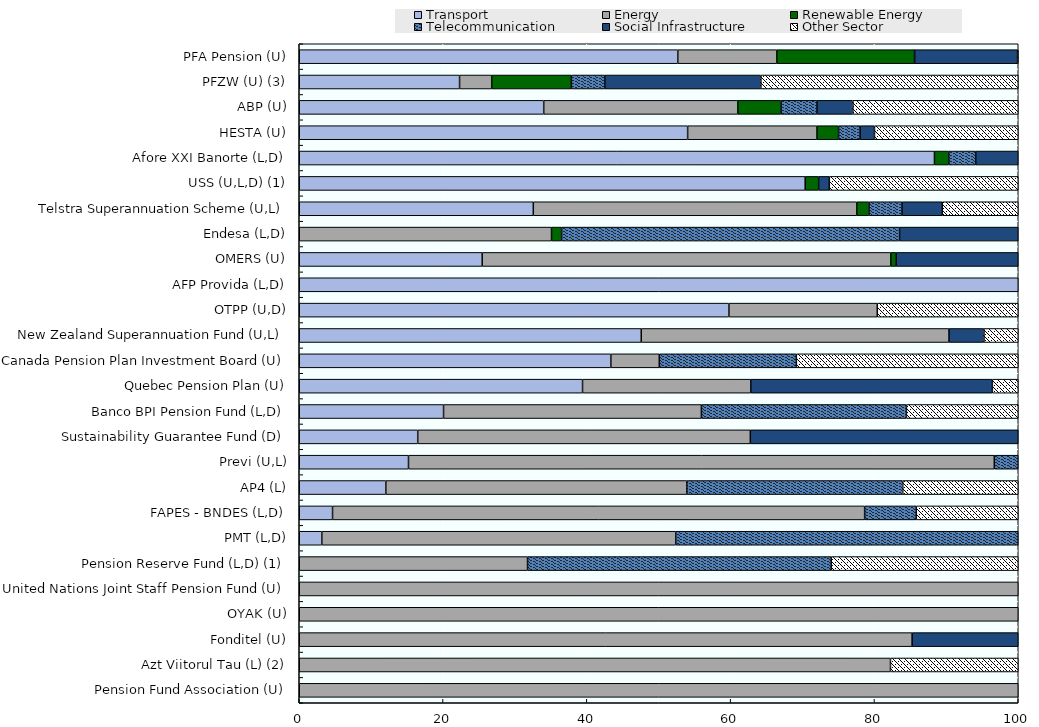
| Category | Transport | Energy | Renewable Energy | Telecommunication | Social Infrastructure | Other Sector |
|---|---|---|---|---|---|---|
| Pension Fund Association (U) | 0 | 100 | 0 | 0 | 0 | 0 |
| Azt Viitorul Tau (L) (2) | 0 | 82.23 | 0 | 0 | 0 | 17.77 |
| Fonditel (U) | 0 | 85.241 | 0 | 0 | 14.759 | 0 |
| OYAK (U) | 0 | 100 | 0 | 0 | 0 | 0 |
| United Nations Joint Staff Pension Fund (U) | 0 | 100 | 0 | 0 | 0 | 0 |
| Pension Reserve Fund (L,D) (1) | 0 | 31.748 | 0 | 42.236 | 0 | 26.016 |
| PMT (L,D) | 3.138 | 49.226 | 0 | 47.635 | 0 | 0 |
| FAPES - BNDES (L,D) | 4.631 | 74.006 | 0 | 7.183 | 0 | 14.18 |
| AP4 (L) | 12.04 | 41.861 | 0 | 30.041 | 0 | 16.058 |
| Previ (U,L) | 15.194 | 81.472 | 0 | 3.334 | 0 | 0 |
| Sustainability Guarantee Fund (D) | 16.479 | 46.259 | 0 | 0 | 37.263 | 0 |
| Banco BPI Pension Fund (L,D) | 20.07 | 35.86 | 0 | 28.515 | 0 | 15.556 |
| Quebec Pension Plan (U) | 39.4 | 23.4 | 0 | 0 | 33.6 | 3.6 |
| Canada Pension Plan Investment Board (U) | 43.338 | 6.736 | 0 | 19.064 | 0 | 30.862 |
| New Zealand Superannuation Fund (U,L) | 47.568 | 42.802 | 0 | 0 | 4.864 | 4.767 |
| OTPP (U,D) | 59.76 | 20.634 | 0 | 0 | 0 | 19.607 |
| AFP Provida (L,D) | 100 | 0 | 0 | 0 | 0 | 0 |
| OMERS (U) | 25.445 | 56.827 | 0.746 | 0 | 16.982 | 0 |
| Endesa (L,D) | 0 | 35.082 | 1.413 | 47.004 | 16.503 | 0 |
| Telstra Superannuation Scheme (U,L) | 32.554 | 44.986 | 1.701 | 4.597 | 5.595 | 10.568 |
| USS (U,L,D) (1) | 70.37 | 0 | 1.871 | 0 | 1.481 | 26.277 |
| Afore XXI Banorte (L,D) | 88.345 | 0 | 1.999 | 3.745 | 5.911 | 0 |
| HESTA (U) | 54.016 | 17.994 | 2.999 | 2.999 | 1.999 | 19.993 |
| ABP (U) | 34.002 | 26.995 | 6.004 | 5.001 | 5.001 | 22.997 |
| PFZW (U) (3) | 22.298 | 4.469 | 11.081 | 4.651 | 21.705 | 35.796 |
| PFA Pension (U) | 52.651 | 13.776 | 19.143 | 0.033 | 14.3 | 0.098 |